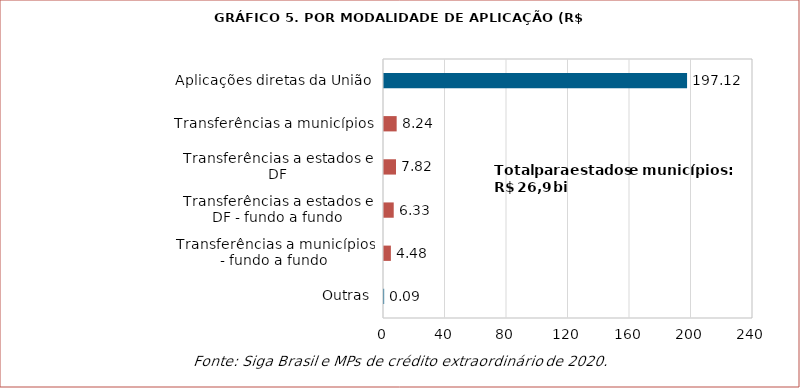
| Category | Valores |
|---|---|
| Outras | 0.094 |
| Transferências a municípios - fundo a fundo | 4.476 |
| Transferências a estados e DF - fundo a fundo | 6.327 |
| Transferências a estados e DF | 7.818 |
| Transferências a municípios | 8.236 |
| Aplicações diretas da União | 197.118 |